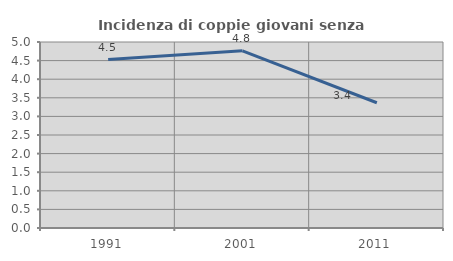
| Category | Incidenza di coppie giovani senza figli |
|---|---|
| 1991.0 | 4.527 |
| 2001.0 | 4.762 |
| 2011.0 | 3.367 |